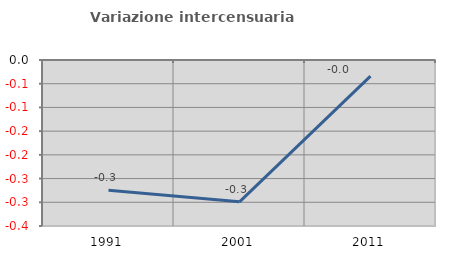
| Category | Variazione intercensuaria annua |
|---|---|
| 1991.0 | -0.274 |
| 2001.0 | -0.299 |
| 2011.0 | -0.034 |